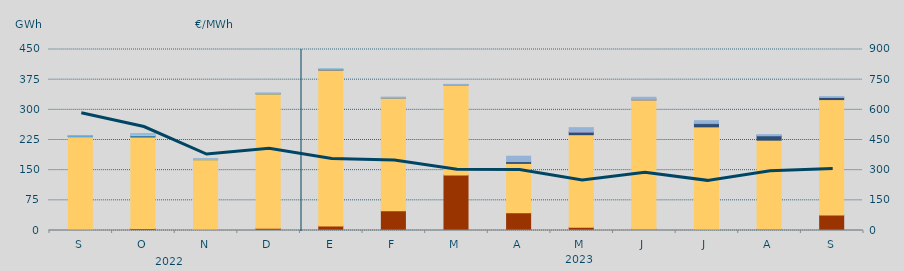
| Category | Carbón | Ciclo Combinado | Cogeneración | Consumo Bombeo | Enlace Península Baleares | Eólica | Hidráulica | Internacionales | Otras Renovables | Residuos no Renovables | Solar fotovoltaica | Solar térmica | Turbinación bombeo |
|---|---|---|---|---|---|---|---|---|---|---|---|---|---|
| S | 555 | 232710.6 | 0 | 982.5 | 388.7 | 0 | 418.25 | 0 | 0 | 0 | 0 | 0 | 708.4 |
| O | 4836.8 | 227776.455 | 0 | 2792.6 | 0 | 0 | 208.75 | 3824.8 | 0 | 0 | 0 | 0 | 1365.5 |
| N | 2212.7 | 174006.854 | 0 | 126 | 0 | 0 | 449.2 | 613.333 | 0 | 0 | 0 | 0 | 1312.25 |
| D | 5478 | 334554.358 | 0 | 258.25 | 0 | 0 | 227.925 | 0 | 0 | 0 | 0 | 0 | 1594.663 |
| E | 11268 | 387716.675 | 0 | 572.573 | 681.8 | 0 | 835.85 | 0 | 0 | 0 | 0 | 0 | 77.5 |
| F | 48958 | 280733.853 | 0 | 43.033 | 0 | 0 | 0 | 0 | 0 | 0 | 0 | 0 | 1846.75 |
| M | 138130.4 | 224071.017 | 0 | 316.875 | 152.4 | 0 | 0 | 0 | 0 | 0 | 0 | 0 | 717.667 |
| A | 43920 | 122955.6 | 0 | 4435.017 | 148.1 | 0 | 0 | 0 | 0 | 0 | 0 | 0 | 13251.877 |
| M | 8172.8 | 230037.608 | 0 | 6374.2 | 1318.3 | 0 | 0 | 0 | 0 | 0 | 0 | 0 | 9849.292 |
| J | 3400 | 321495.908 | 0 | 191.083 | 1224 | 175.975 | 0 | 0 | 0 | 0 | 0 | 0 | 4721.775 |
| J | 2260 | 255417.442 | 0 | 8045.584 | 1144 | 41.666 | 475 | 647.8 | 0 | 0 | 0 | 0 | 5129.95 |
| A | 2834 | 221717.226 | 0 | 11049.55 | 362 | 0 | 144.325 | 0 | 0 | 0 | 0 | 0 | 2296.991 |
| S | 38425 | 287082.594 | 0 | 5227.584 | 0 | 0 | 0 | 0 | 0 | 0 | 0 | 0 | 2105.767 |